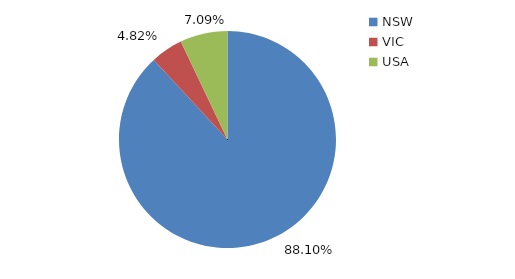
| Category | Series 0 |
|---|---|
| NSW | 0.881 |
| VIC | 0.048 |
| USA | 0.071 |